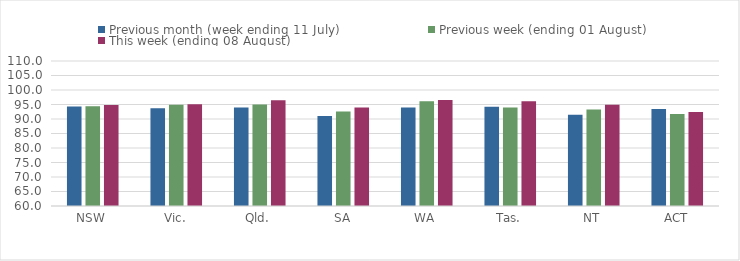
| Category | Previous month (week ending 11 July) | Previous week (ending 01 August) | This week (ending 08 August) |
|---|---|---|---|
| NSW | 94.269 | 94.4 | 94.822 |
| Vic. | 93.687 | 94.933 | 95.128 |
| Qld. | 93.975 | 94.972 | 96.466 |
| SA | 91.057 | 92.55 | 93.951 |
| WA | 93.998 | 96.132 | 96.556 |
| Tas. | 94.26 | 94.004 | 96.099 |
| NT | 91.46 | 93.261 | 94.904 |
| ACT | 93.475 | 91.763 | 92.418 |